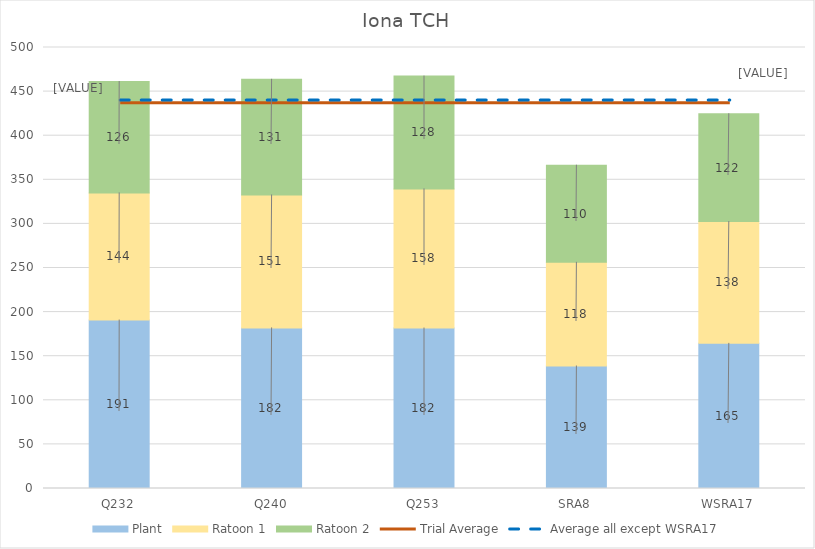
| Category | Plant | Ratoon 1 | Ratoon 2 |
|---|---|---|---|
| Q232 | 190.994 | 144.138 | 126.269 |
| Q240 | 182.083 | 150.739 | 131.108 |
| Q253 | 181.932 | 157.765 | 127.898 |
| SRA8 | 138.884 | 117.538 | 110.114 |
| WSRA17 | 164.555 | 138.144 | 122.188 |